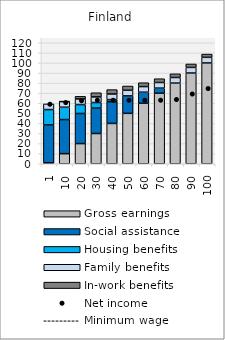
| Category | Gross earnings | Social assistance | Housing benefits | Family benefits | In-work benefits |
|---|---|---|---|---|---|
| 1.0 | 1 | 37.497 | 15.267 | 5.576 | 0 |
| 10.0 | 10 | 33.83 | 12.245 | 5.576 | 0.364 |
| 20.0 | 19.999 | 29.865 | 8.882 | 5.576 | 2.572 |
| 30.0 | 30.001 | 25.213 | 5.525 | 5.576 | 4.14 |
| 40.0 | 40 | 21.47 | 2.162 | 5.576 | 4.347 |
| 50.0 | 50 | 17.314 | 0 | 5.576 | 4.23 |
| 60.0 | 60 | 10.972 | 0 | 5.576 | 3.854 |
| 70.0 | 70.001 | 5.032 | 0 | 5.576 | 3.757 |
| 80.0 | 80.001 | 0 | 0 | 5.576 | 3.633 |
| 90.0 | 90 | 0 | 0 | 5.576 | 3.418 |
| 100.0 | 100 | 0 | 0 | 5.576 | 3.202 |